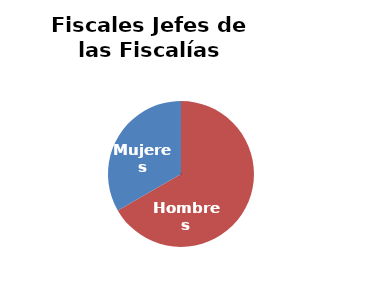
| Category | Fiscales Jefes de las Fiscalías Provinciales |
|---|---|
| Hombres | 28 |
| Mujeres | 14 |